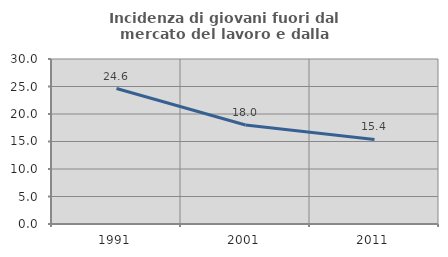
| Category | Incidenza di giovani fuori dal mercato del lavoro e dalla formazione  |
|---|---|
| 1991.0 | 24.631 |
| 2001.0 | 17.991 |
| 2011.0 | 15.368 |